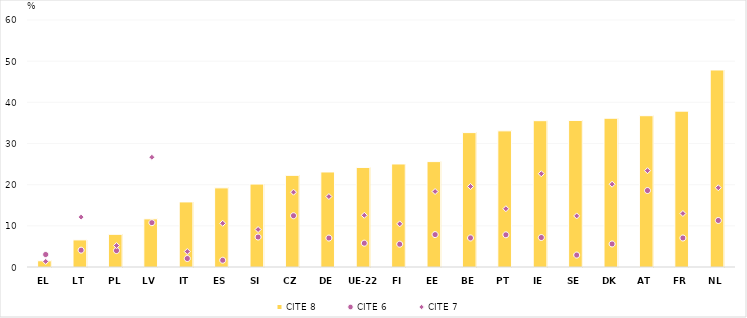
| Category | CITE 8 |
|---|---|
| EL | 1.511 |
| LT | 6.584 |
| PL | 7.938 |
| LV | 11.696 |
| IT | 15.809 |
| ES | 19.223 |
| SI | 20.145 |
| CZ | 22.263 |
| DE | 23.088 |
| UE-22 | 24.186 |
| FI | 25.024 |
| EE | 25.603 |
| BE | 32.646 |
| PT | 33.074 |
| IE | 35.545 |
| SE | 35.603 |
| DK | 36.137 |
| AT | 36.75 |
| FR | 37.862 |
| NL | 47.859 |